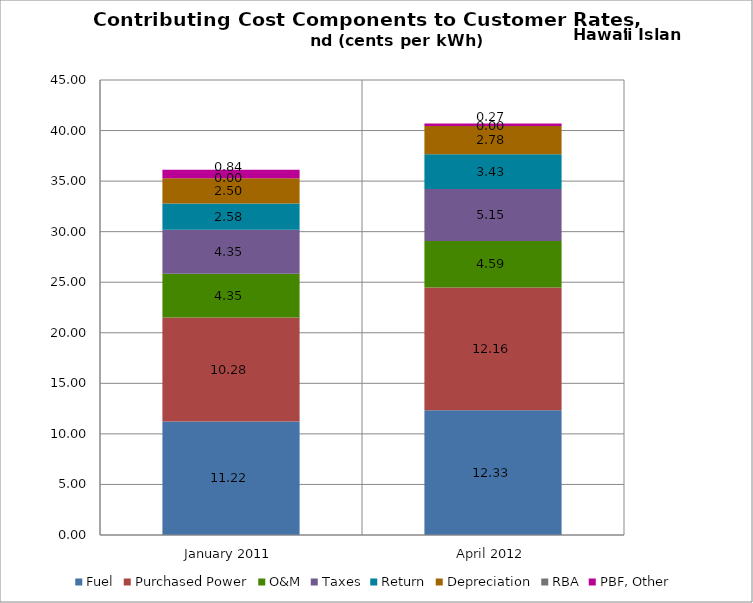
| Category | Fuel | Purchased Power | O&M | Taxes | Return | Depreciation | RBA | PBF, Other |
|---|---|---|---|---|---|---|---|---|
| January 2011 | 11.22 | 10.28 | 4.35 | 4.35 | 2.58 | 2.5 | 0 | 0.84 |
| April 2012 | 12.33 | 12.16 | 4.59 | 5.15 | 3.43 | 2.78 | 0 | 0.27 |